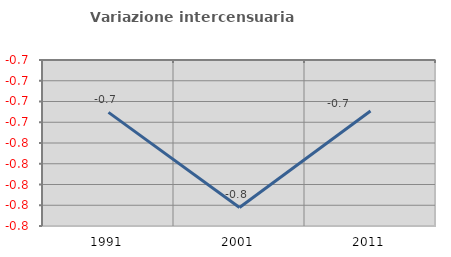
| Category | Variazione intercensuaria annua |
|---|---|
| 1991.0 | -0.73 |
| 2001.0 | -0.822 |
| 2011.0 | -0.729 |